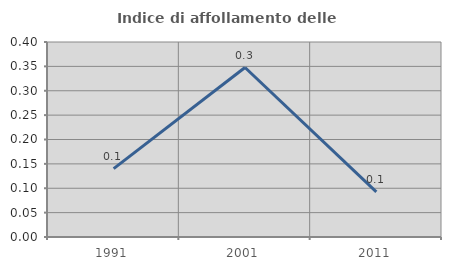
| Category | Indice di affollamento delle abitazioni  |
|---|---|
| 1991.0 | 0.14 |
| 2001.0 | 0.348 |
| 2011.0 | 0.093 |